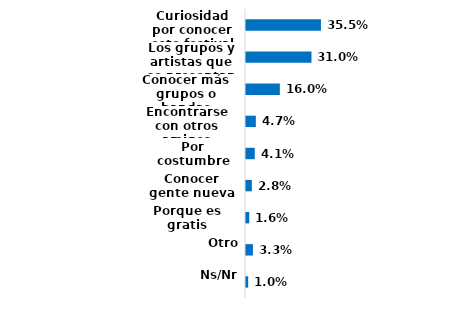
| Category | Series 0 |
|---|---|
| Curiosidad por conocer este festival | 0.355 |
| Los grupos y artistas que se presentan | 0.31 |
| Conocer más grupos o bandas | 0.16 |
| Encontrarse con otros amigos | 0.047 |
| Por costumbre | 0.041 |
| Conocer gente nueva | 0.028 |
| Porque es gratis | 0.016 |
| Otro | 0.033 |
| Ns/Nr | 0.01 |